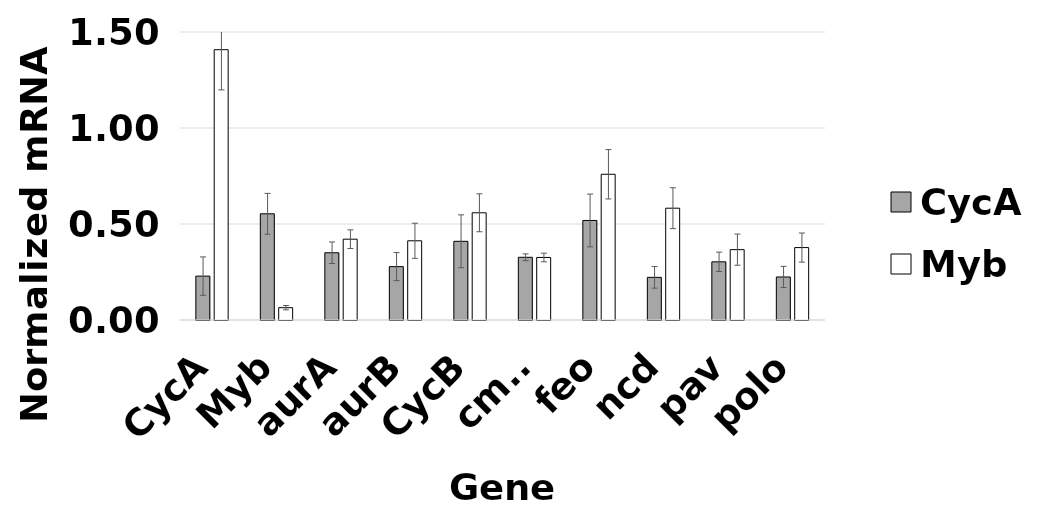
| Category | CycA | Myb |
|---|---|---|
| CycA | 0.229 | 1.408 |
| Myb | 0.553 | 0.064 |
| aurA | 0.35 | 0.421 |
| aurB | 0.278 | 0.412 |
| CycB | 0.41 | 0.558 |
| cmet | 0.327 | 0.326 |
| feo | 0.518 | 0.759 |
| ncd | 0.222 | 0.582 |
| pav | 0.303 | 0.366 |
| polo | 0.224 | 0.377 |